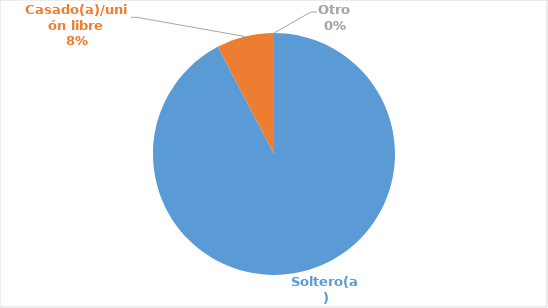
| Category | Series 0 |
|---|---|
| Soltero(a) | 0.923 |
| Casado(a)/unión libre | 0.077 |
| Otro | 0 |